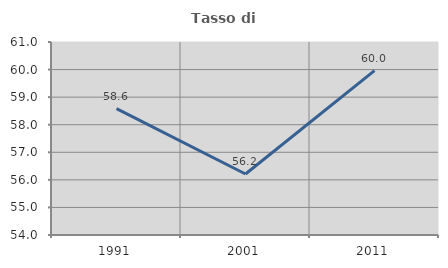
| Category | Tasso di occupazione   |
|---|---|
| 1991.0 | 58.581 |
| 2001.0 | 56.212 |
| 2011.0 | 59.962 |